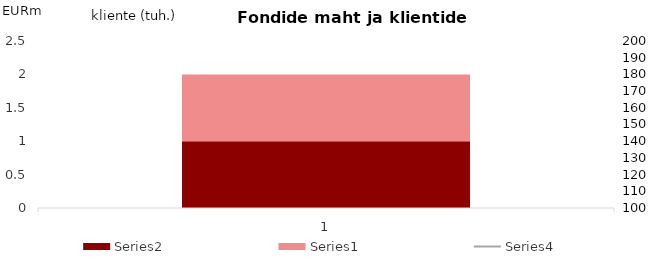
| Category | Series 2 | Series 1 |
|---|---|---|
| 0 | 1 | 1 |